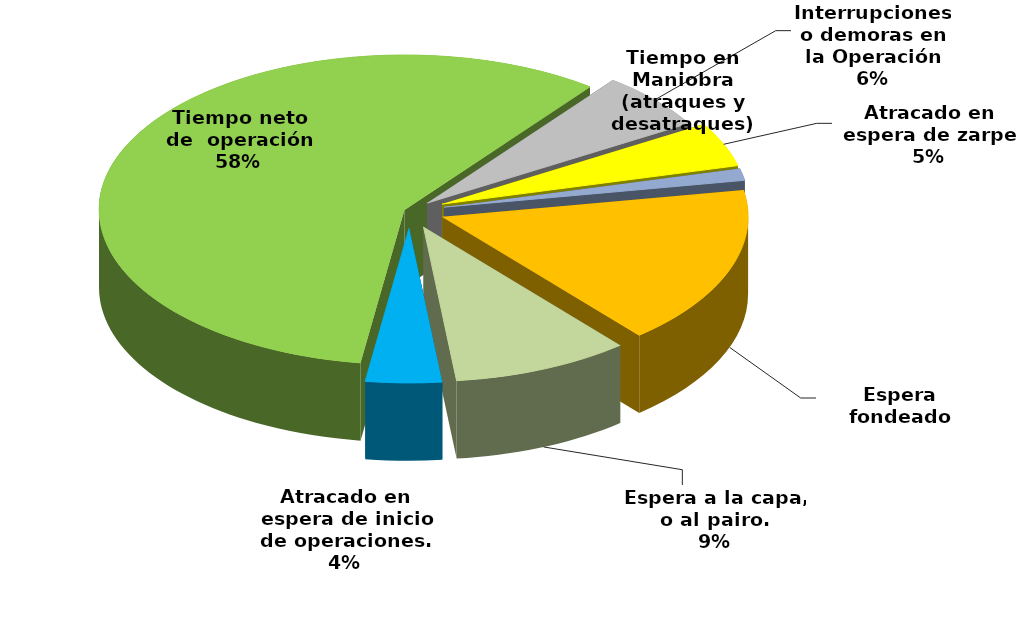
| Category | Series 0 |
|---|---|
| Espera fondeado | 11055.75 |
| Espera a la capa, o al pairo. | 6245.217 |
| Atracado en espera de inicio de operaciones. | 2673.708 |
| Tiempo neto de  operación | 38583.137 |
| Interrupciones o demoras en la Operación | 3972.67 |
| Atracado en espera de zarpe | 3070.231 |
| Tiempo en Maniobra (atraques y desatraques) | 816.333 |